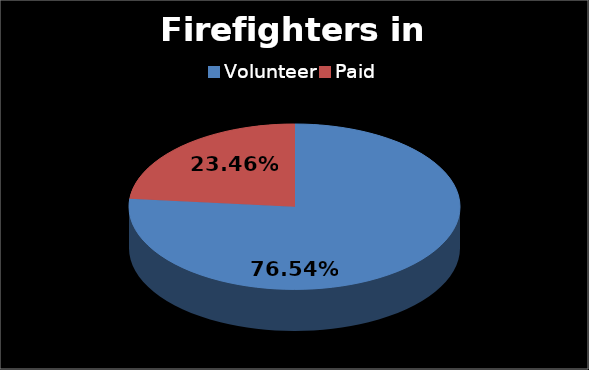
| Category | Series 0 |
|---|---|
| Volunteer | 0.765 |
| Paid | 0.235 |